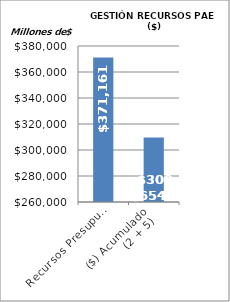
| Category | RECURSOS PAE ($) |
|---|---|
| Recursos Presupuestados | 371161 |
| ($) Acumulado
(2 + 5) | 309654 |